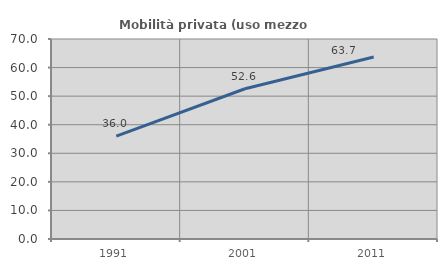
| Category | Mobilità privata (uso mezzo privato) |
|---|---|
| 1991.0 | 35.975 |
| 2001.0 | 52.588 |
| 2011.0 | 63.676 |